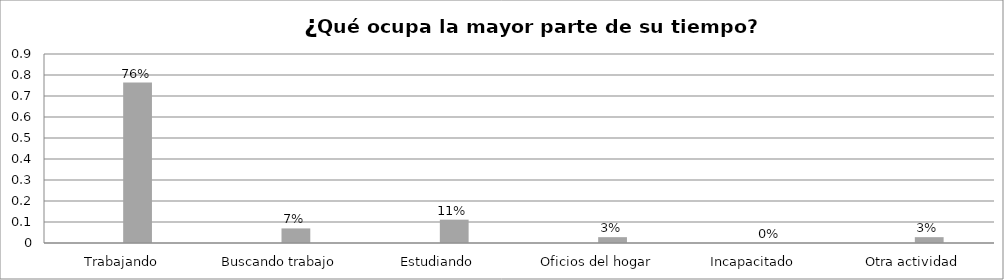
| Category | Series 0 | Series 1 | Series 2 | Series 3 |
|---|---|---|---|---|
| Trabajando |  |  | 0.764 |  |
| Buscando trabajo |  |  | 0.069 |  |
| Estudiando |  |  | 0.111 |  |
| Oficios del hogar |  |  | 0.028 |  |
| Incapacitado  |  |  | 0 |  |
| Otra actividad |  |  | 0.028 |  |